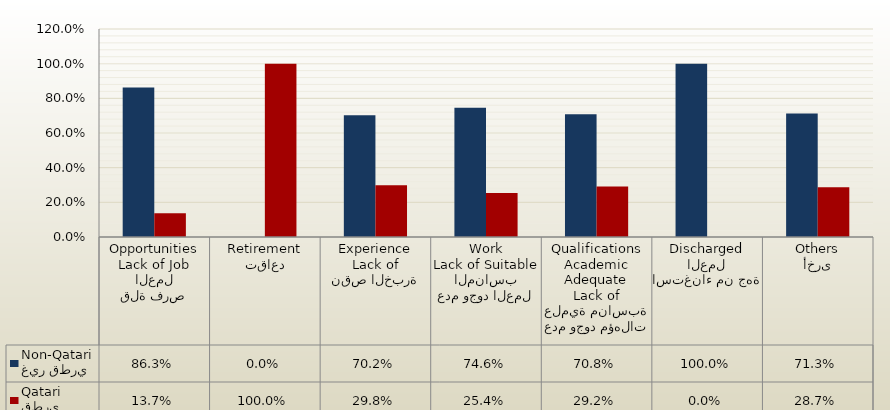
| Category | غير قطري
Non-Qatari | قطري
Qatari |
|---|---|---|
| قلة فرص العمل
Lack of Job Opportunities | 0.863 | 0.137 |
| تقاعد
Retirement | 0 | 1 |
| نقص الخبرة
Lack of Experience | 0.702 | 0.298 |
| عدم وجود العمل المناسب
Lack of Suitable Work | 0.746 | 0.254 |
| عدم وجود مؤهلات علمية مناسبة
Lack of Adequate Academic Qualifications | 0.708 | 0.292 |
| استغناء من جهة العمل
Discharged | 1 | 0 |
| أخرى
Others | 0.713 | 0.287 |